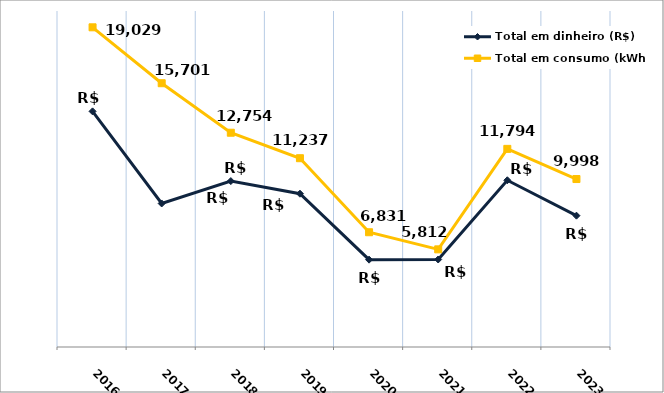
| Category | Total em dinheiro (R$) | Total em consumo (kWh) |
|---|---|---|
| 2016.0 | 14025.61 | 19029 |
| 2017.0 | 8543.37 | 15701 |
| 2018.0 | 9875.5 | 12754 |
| 2019.0 | 9125.56 | 11237 |
| 2020.0 | 5198.33 | 6831 |
| 2021.0 | 5209.06 | 5812 |
| 2022.0 | 9924.19 | 11794 |
| 2023.0 | 7818.04 | 9998 |